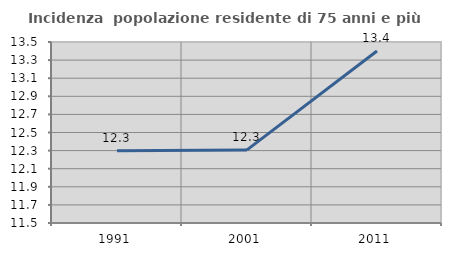
| Category | Incidenza  popolazione residente di 75 anni e più |
|---|---|
| 1991.0 | 12.298 |
| 2001.0 | 12.308 |
| 2011.0 | 13.4 |